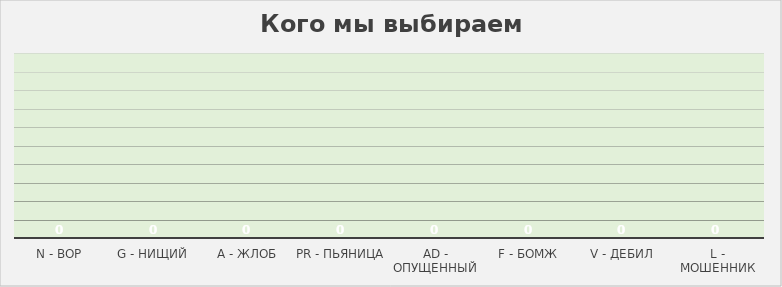
| Category | Series 0 |
|---|---|
| n - вор | 0 |
| g - нищий | 0 |
| a - жлоб | 0 |
| pr - пьяница | 0 |
| ad - опущенный | 0 |
| f - бомж | 0 |
| v - дебил | 0 |
| l - мошенник | 0 |